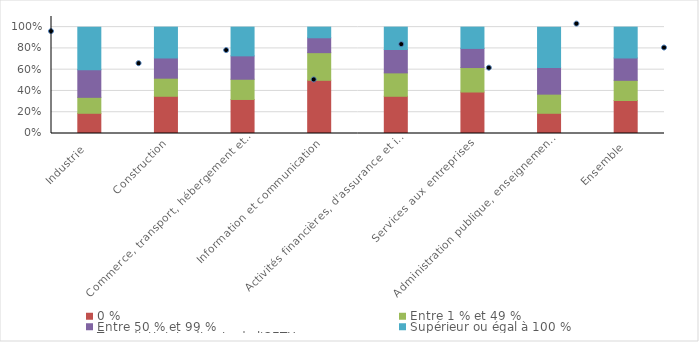
| Category | 0 % | Entre 1 % et 49 % | Entre 50 % et 99 % | Supérieur ou égal à 100 % |
|---|---|---|---|---|
| Industrie  | 19 | 15 | 26 | 40 |
| Construction | 35 | 17 | 19 | 29 |
| Commerce, transport, hébergement et restauration | 32 | 19 | 22 | 27 |
| Information et communication | 50 | 26 | 14 | 10 |
| Activités financières, d'assurance et immobilières | 35 | 22 | 22 | 21 |
| Services aux entreprises | 39 | 23 | 18 | 20 |
| Administration publique, enseignement, santé humaine et action sociale* | 19 | 18 | 25 | 38 |
| Ensemble | 31 | 19 | 21 | 29 |